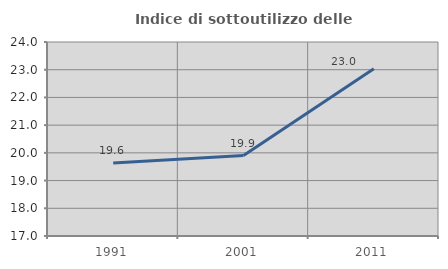
| Category | Indice di sottoutilizzo delle abitazioni  |
|---|---|
| 1991.0 | 19.632 |
| 2001.0 | 19.904 |
| 2011.0 | 23.037 |